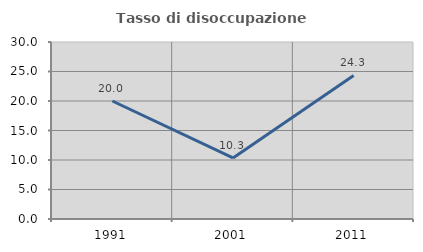
| Category | Tasso di disoccupazione giovanile  |
|---|---|
| 1991.0 | 20 |
| 2001.0 | 10.345 |
| 2011.0 | 24.324 |